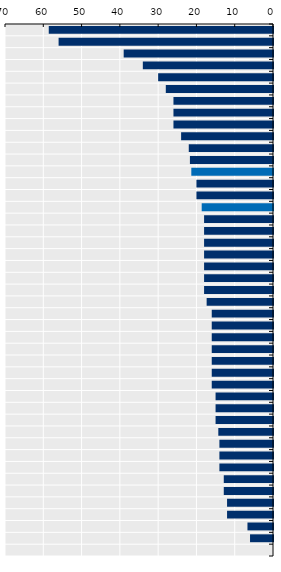
| Category | Length in weeks |
|---|---|
| Bulgaria | 58.571 |
| Greece | 56 |
| United Kingdom | 39 |
| Slovak Republic | 34 |
| Croatia | 30 |
| Czechia | 28 |
| Iceland | 26 |
| New Zealand | 26 |
| Ireland | 26 |
| Hungary | 24 |
| Denmark | 22 |
| Italy | 21.7 |
| EU average | 21.336 |
| Luxembourg | 20 |
| Poland | 20 |
| OECD average | 18.624 |
| Chile | 18 |
| Colombia | 18 |
| Norway | 18 |
| Malta | 18 |
| Romania | 18 |
| Lithuania | 18 |
| Cyprus | 18 |
| Costa Rica | 17.333 |
| Austria | 16 |
| Netherlands | 16 |
| France | 16 |
| Türkiye | 16 |
| Spain | 16 |
| Latvia | 16 |
| Canada | 16 |
| Israel | 15 |
| Slovenia | 15 |
| Belgium | 15 |
| Estonia | 14.286 |
| Germany | 14 |
| Japan | 14 |
| Switzerland | 14 |
| Korea | 12.857 |
| Sweden | 12.857 |
| Mexico | 12 |
| Australia | 12 |
| Finland | 6.67 |
| Portugal | 6 |
| United States | 0 |